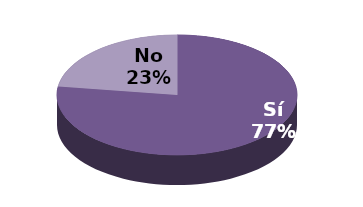
| Category | Series 1 |
|---|---|
| Sí | 17 |
| No | 5 |